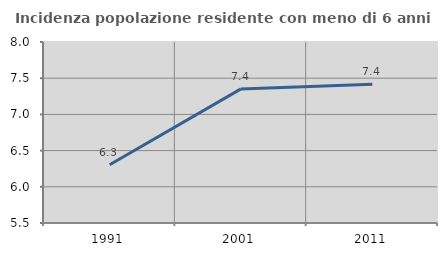
| Category | Incidenza popolazione residente con meno di 6 anni |
|---|---|
| 1991.0 | 6.304 |
| 2001.0 | 7.352 |
| 2011.0 | 7.417 |